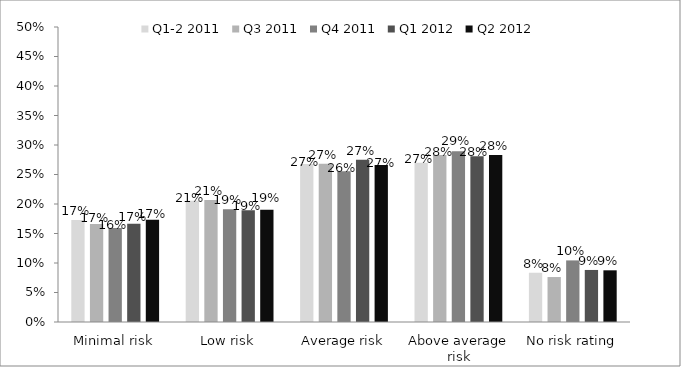
| Category | Q1-2 2011 | Q3 2011 | Q4 2011 | Q1 2012 | Q2 2012 |
|---|---|---|---|---|---|
| Minimal risk | 0.173 | 0.166 | 0.159 | 0.167 | 0.173 |
| Low risk | 0.206 | 0.207 | 0.191 | 0.189 | 0.19 |
| Average risk | 0.268 | 0.268 | 0.256 | 0.275 | 0.266 |
| Above average risk | 0.27 | 0.283 | 0.29 | 0.281 | 0.283 |
| No risk rating | 0.083 | 0.076 | 0.104 | 0.088 | 0.088 |